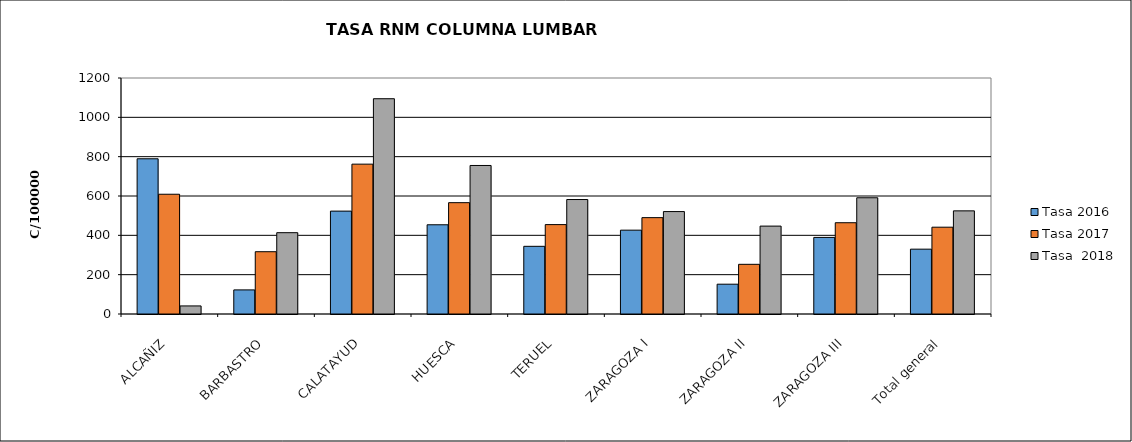
| Category | Tasa 2016 | Tasa 2017 | Tasa  2018 |
|---|---|---|---|
| ALCAÑIZ | 789.26 | 608.928 | 41.054 |
| BARBASTRO | 122.586 | 316.715 | 413.499 |
| CALATAYUD | 523.099 | 761.924 | 1094.599 |
| HUESCA | 453.668 | 566.078 | 755.236 |
| TERUEL | 344.115 | 454.531 | 582.09 |
| ZARAGOZA I | 426.324 | 490.012 | 520.868 |
| ZARAGOZA II | 151.588 | 252.604 | 446.939 |
| ZARAGOZA III | 389.427 | 464.1 | 591.058 |
| Total general | 329.7 | 441.355 | 524.381 |